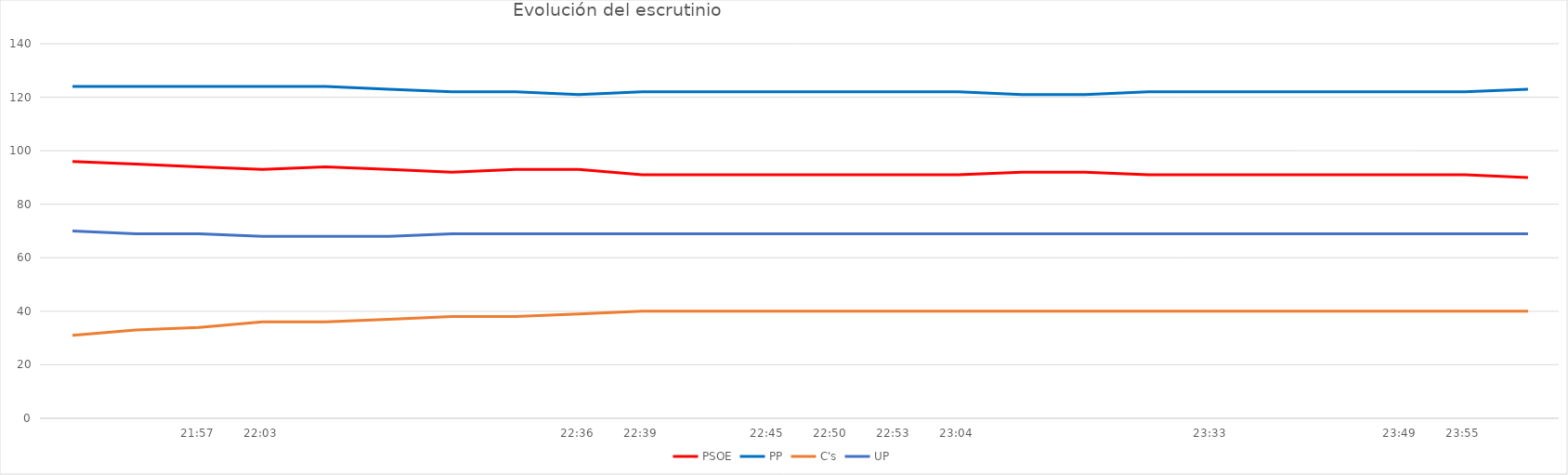
| Category | PSOE | PP | C's | UP |
|---|---|---|---|---|
| nan | 96 | 124 | 31 | 70 |
| nan | 95 | 124 | 33 | 69 |
| 0.9145833333333333 | 94 | 124 | 34 | 69 |
| 0.9187500000000001 | 93 | 124 | 36 | 68 |
| nan | 94 | 124 | 36 | 68 |
| nan | 93 | 123 | 37 | 68 |
| nan | 92 | 122 | 38 | 69 |
| nan | 93 | 122 | 38 | 69 |
| 0.9416666666666668 | 93 | 121 | 39 | 69 |
| 0.94375 | 91 | 122 | 40 | 69 |
| nan | 91 | 122 | 40 | 69 |
| 0.9479166666666666 | 91 | 122 | 40 | 69 |
| 0.9513888888888888 | 91 | 122 | 40 | 69 |
| 0.9534722222222222 | 91 | 122 | 40 | 69 |
| 0.9611111111111111 | 91 | 122 | 40 | 69 |
| nan | 92 | 121 | 40 | 69 |
| nan | 92 | 121 | 40 | 69 |
| nan | 91 | 122 | 40 | 69 |
| 0.9812500000000001 | 91 | 122 | 40 | 69 |
| nan | 91 | 122 | 40 | 69 |
| nan | 91 | 122 | 40 | 69 |
| 0.9923611111111111 | 91 | 122 | 40 | 69 |
| 0.9965277777777778 | 91 | 122 | 40 | 69 |
| nan | 90 | 123 | 40 | 69 |